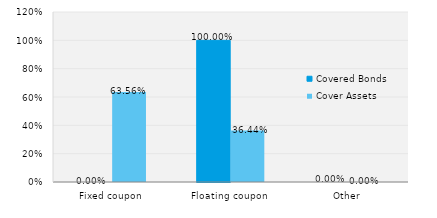
| Category | Covered Bonds | Cover Assets |
|---|---|---|
| Fixed coupon | 0 | 0.636 |
| Floating coupon | 1 | 0.364 |
| Other | 0 | 0 |